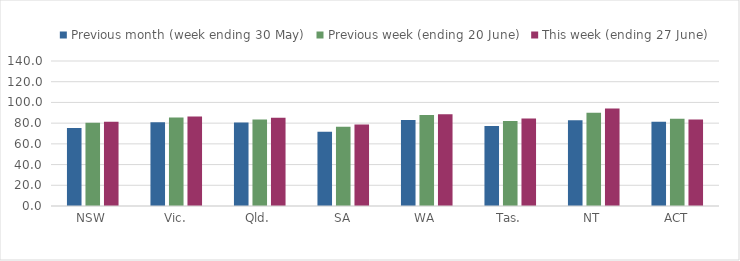
| Category | Previous month (week ending 30 May) | Previous week (ending 20 June) | This week (ending 27 June) |
|---|---|---|---|
| NSW | 75.429 | 80.355 | 81.309 |
| Vic. | 80.896 | 85.41 | 86.369 |
| Qld. | 80.586 | 83.503 | 85.18 |
| SA | 71.628 | 76.625 | 78.741 |
| WA | 82.934 | 87.753 | 88.693 |
| Tas. | 77.288 | 81.964 | 84.557 |
| NT | 82.755 | 90 | 94.194 |
| ACT | 81.344 | 84.214 | 83.503 |